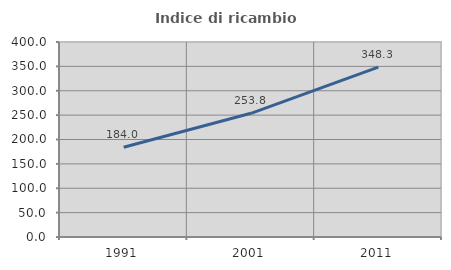
| Category | Indice di ricambio occupazionale  |
|---|---|
| 1991.0 | 183.951 |
| 2001.0 | 253.75 |
| 2011.0 | 348.315 |